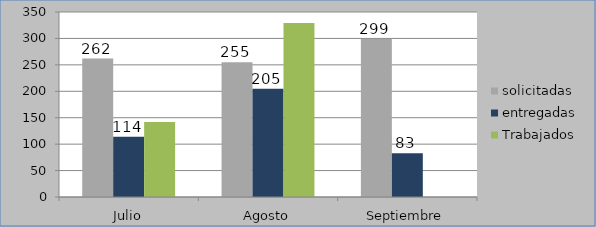
| Category | solicitadas | entregadas | Trabajados |
|---|---|---|---|
| Julio | 262 | 114 | 142 |
| Agosto | 255 | 205 | 329 |
| Septiembre | 299 | 83 | 0 |